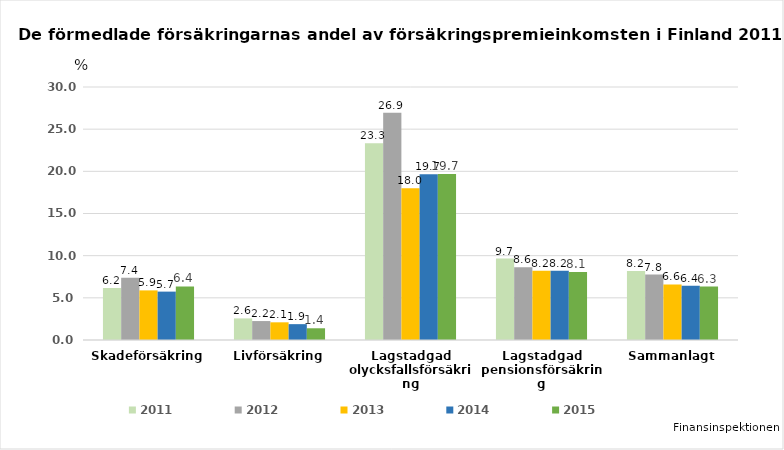
| Category | 2011 | 2012 | 2013 | 2014 | 2015 |
|---|---|---|---|---|---|
| Skadeförsäkring | 6.168 | 7.375 | 5.882 | 5.737 | 6.356 |
| Livförsäkring | 2.56 | 2.246 | 2.097 | 1.88 | 1.39 |
| Lagstadgad olycksfallsförsäkring | 23.324 | 26.944 | 17.98 | 19.654 | 19.692 |
| Lagstadgad pensionsförsäkring | 9.661 | 8.637 | 8.204 | 8.203 | 8.075 |
| Sammanlagt | 8.167 | 7.754 | 6.584 | 6.436 | 6.337 |